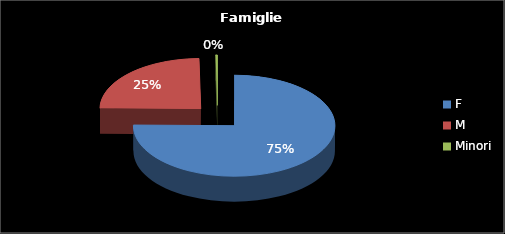
| Category | Series 0 |
|---|---|
| F | 267 |
| M | 87 |
| Minori | 1 |